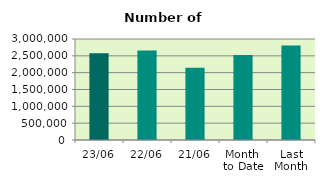
| Category | Series 0 |
|---|---|
| 23/06 | 2573734 |
| 22/06 | 2661228 |
| 21/06 | 2147956 |
| Month 
to Date | 2522055.765 |
| Last
Month | 2808947.182 |